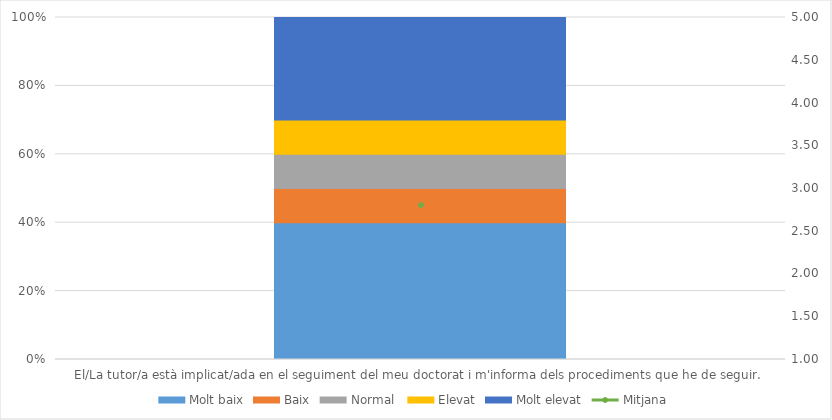
| Category | Molt baix | Baix | Normal  | Elevat | Molt elevat |
|---|---|---|---|---|---|
| El/La tutor/a està implicat/ada en el seguiment del meu doctorat i m'informa dels procediments que he de seguir.  | 4 | 1 | 1 | 1 | 3 |